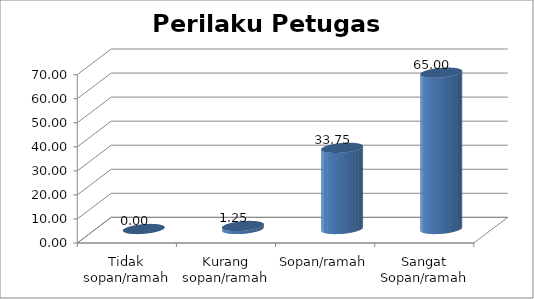
| Category | Perilaku Petugas Pelayanan |
|---|---|
| Tidak sopan/ramah | 0 |
| Kurang sopan/ramah | 1.25 |
| Sopan/ramah | 33.75 |
| Sangat Sopan/ramah | 65 |